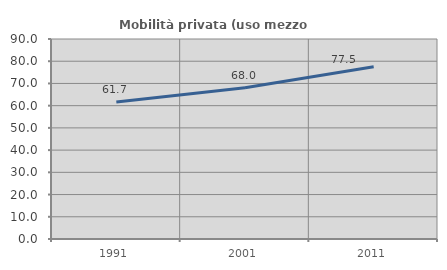
| Category | Mobilità privata (uso mezzo privato) |
|---|---|
| 1991.0 | 61.658 |
| 2001.0 | 68.033 |
| 2011.0 | 77.472 |